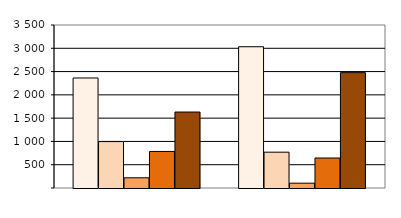
| Category | Series 0 | Series 1 | Series 2 | Series 3 | Series 4 |
|---|---|---|---|---|---|
| 0 | 2362 | 997 | 219 | 785 | 1631 |
| 1 | 3033 | 769 | 104 | 644 | 2477 |